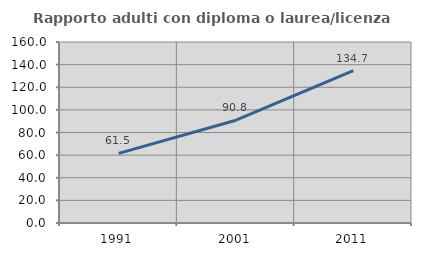
| Category | Rapporto adulti con diploma o laurea/licenza media  |
|---|---|
| 1991.0 | 61.538 |
| 2001.0 | 90.835 |
| 2011.0 | 134.745 |